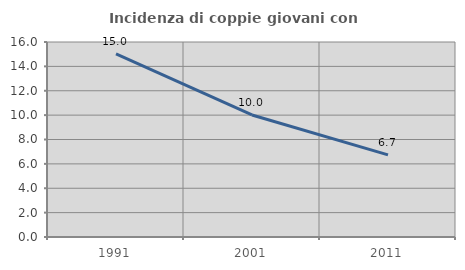
| Category | Incidenza di coppie giovani con figli |
|---|---|
| 1991.0 | 15.021 |
| 2001.0 | 10.014 |
| 2011.0 | 6.735 |